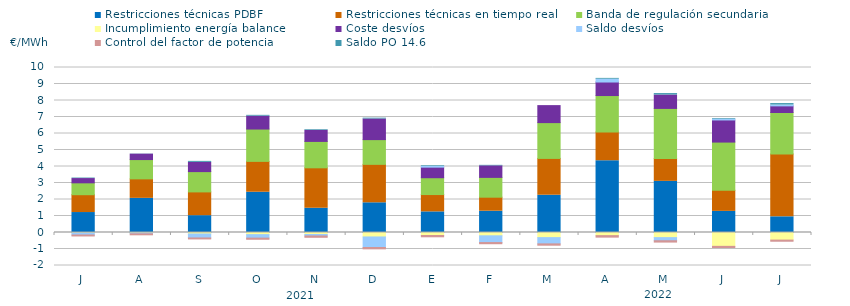
| Category | Restricciones técnicas PDBF | Restricciones técnicas en tiempo real | Banda de regulación secundaria | Incumplimiento energía balance | Coste desvíos | Saldo desvíos | Control del factor de potencia | Saldo PO 14.6 |
|---|---|---|---|---|---|---|---|---|
| J | 1.21 | 1.08 | 0.72 | -0.03 | 0.26 | -0.12 | -0.06 | 0.03 |
| A | 2.07 | 1.18 | 1.17 | -0.03 | 0.33 | -0.05 | -0.06 | 0.01 |
| S | 1.02 | 1.44 | 1.23 | -0.09 | 0.56 | -0.24 | -0.06 | 0.06 |
| O | 2.44 | 1.87 | 1.96 | -0.13 | 0.78 | -0.21 | -0.07 | 0.05 |
| N | 1.47 | 2.45 | 1.6 | -0.12 | 0.67 | -0.09 | -0.08 | 0.04 |
| D | 1.8 | 2.33 | 1.5 | -0.27 | 1.25 | -0.64 | -0.08 | 0.05 |
| E | 1.25 | 1.05 | 1.02 | -0.18 | 0.64 | 0.04 | -0.08 | 0.04 |
| F | 1.29 | 0.85 | 1.2 | -0.2 | 0.7 | -0.41 | -0.07 | 0.03 |
| M | 2.26 | 2.23 | 2.17 | -0.31 | 1.03 | -0.38 | -0.08 | 0 |
| A | 4.35 | 1.74 | 2.21 | -0.19 | 0.82 | 0.17 | -0.09 | 0.05 |
| M | 3.1 | 1.39 | 3.03 | -0.31 | 0.81 | -0.19 | -0.08 | 0.09 |
| J | 1.28 | 1.28 | 2.92 | -0.84 | 1.34 | 0.05 | -0.07 | 0.04 |
| J | 0.95 | 3.81 | 2.514 | -0.46 | 0.4 | 0.05 | -0.07 | 0.09 |